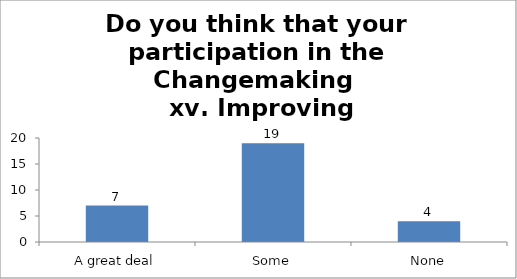
| Category | Do you think that your participation in the Changemaking 
 xv. Improving confidence. |
|---|---|
| A great deal | 7 |
| Some | 19 |
| None | 4 |